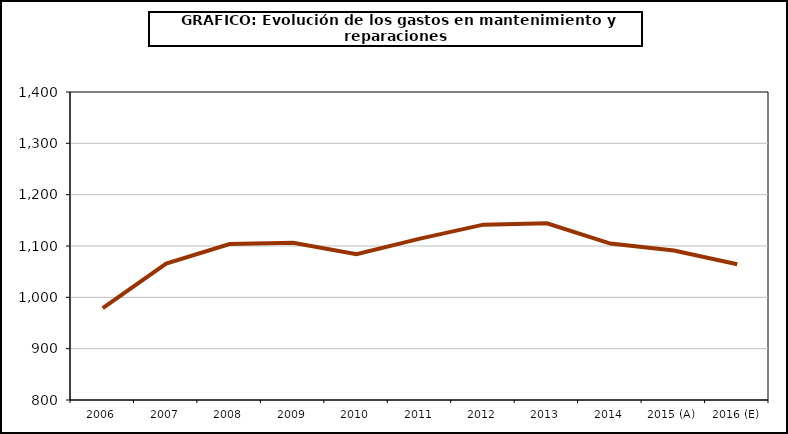
| Category | Series 0 |
|---|---|
| 0 | 979.04 |
| 1 | 1065.637 |
| 2 | 1103.67 |
| 3 | 1106.325 |
| 4 | 1083.98 |
| 5 | 1114.377 |
| 6 | 1141.575 |
| 7 | 1144.341 |
| 8 | 1104.719 |
| 9 | 1091.05 |
| 10 | 1064.325 |